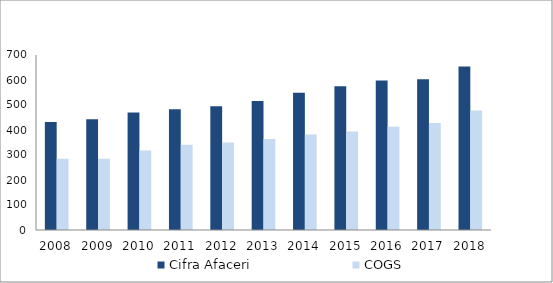
| Category | Cifra Afaceri | COGS |
|---|---|---|
| 2008.0 | 432 | 285.342 |
| 2009.0 | 443 | 284.863 |
| 2010.0 | 470 | 318.13 |
| 2011.0 | 483 | 341.071 |
| 2012.0 | 495 | 349.526 |
| 2013.0 | 516 | 363.75 |
| 2014.0 | 549 | 382.486 |
| 2015.0 | 575 | 394.354 |
| 2016.0 | 598 | 413.313 |
| 2017.0 | 603 | 427.659 |
| 2018.0 | 654 | 477.858 |